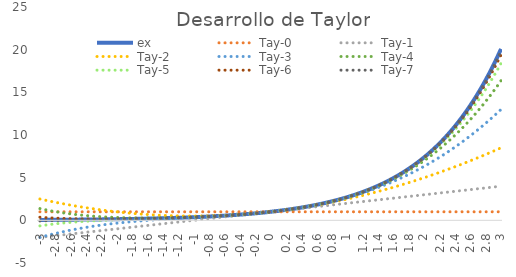
| Category | ex | Tay-0 | Tay-1 | Tay-2 | Tay-3 | Tay-4 | Tay-5 | Tay-6 | Tay-7 |
|---|---|---|---|---|---|---|---|---|---|
| -3.0 | 0.05 | 1 | -2 | 2.5 | -2 | 1.375 | -0.65 | 0.363 | -0.071 |
| -2.95 | 0.052 | 1 | -1.95 | 2.401 | -1.877 | 1.278 | -0.584 | 0.332 | -0.054 |
| -2.9000000000000004 | 0.055 | 1 | -1.9 | 2.305 | -1.76 | 1.187 | -0.522 | 0.304 | -0.038 |
| -2.8500000000000005 | 0.058 | 1 | -1.85 | 2.211 | -1.647 | 1.102 | -0.465 | 0.279 | -0.024 |
| -2.8000000000000007 | 0.061 | 1 | -1.8 | 2.12 | -1.539 | 1.022 | -0.412 | 0.257 | -0.01 |
| -2.750000000000001 | 0.064 | 1 | -1.75 | 2.031 | -1.435 | 0.948 | -0.363 | 0.238 | 0.002 |
| -2.700000000000001 | 0.067 | 1 | -1.7 | 1.945 | -1.336 | 0.879 | -0.317 | 0.221 | 0.014 |
| -2.6500000000000012 | 0.071 | 1 | -1.65 | 1.861 | -1.24 | 0.814 | -0.275 | 0.206 | 0.024 |
| -2.6000000000000014 | 0.074 | 1 | -1.6 | 1.78 | -1.149 | 0.755 | -0.235 | 0.194 | 0.034 |
| -2.5500000000000016 | 0.078 | 1 | -1.55 | 1.701 | -1.062 | 0.699 | -0.199 | 0.183 | 0.044 |
| -2.5000000000000018 | 0.082 | 1 | -1.5 | 1.625 | -0.979 | 0.648 | -0.165 | 0.174 | 0.053 |
| -2.450000000000002 | 0.086 | 1 | -1.45 | 1.551 | -0.9 | 0.601 | -0.134 | 0.166 | 0.061 |
| -2.400000000000002 | 0.091 | 1 | -1.4 | 1.48 | -0.824 | 0.558 | -0.105 | 0.16 | 0.069 |
| -2.3500000000000023 | 0.095 | 1 | -1.35 | 1.411 | -0.752 | 0.519 | -0.078 | 0.156 | 0.077 |
| -2.3000000000000025 | 0.1 | 1 | -1.3 | 1.345 | -0.683 | 0.483 | -0.053 | 0.152 | 0.085 |
| -2.2500000000000027 | 0.105 | 1 | -1.25 | 1.281 | -0.617 | 0.451 | -0.03 | 0.15 | 0.092 |
| -2.200000000000003 | 0.111 | 1 | -1.2 | 1.22 | -0.555 | 0.421 | -0.008 | 0.149 | 0.1 |
| -2.150000000000003 | 0.116 | 1 | -1.15 | 1.161 | -0.495 | 0.395 | 0.012 | 0.15 | 0.107 |
| -2.100000000000003 | 0.122 | 1 | -1.1 | 1.105 | -0.439 | 0.372 | 0.031 | 0.151 | 0.115 |
| -2.0500000000000034 | 0.129 | 1 | -1.05 | 1.051 | -0.385 | 0.351 | 0.05 | 0.153 | 0.122 |
| -2.0000000000000036 | 0.135 | 1 | -1 | 1 | -0.333 | 0.333 | 0.067 | 0.156 | 0.13 |
| -1.9500000000000035 | 0.142 | 1 | -0.95 | 0.951 | -0.285 | 0.318 | 0.083 | 0.159 | 0.138 |
| -1.9000000000000035 | 0.15 | 1 | -0.9 | 0.905 | -0.238 | 0.305 | 0.098 | 0.164 | 0.146 |
| -1.8500000000000034 | 0.157 | 1 | -0.85 | 0.861 | -0.194 | 0.294 | 0.113 | 0.169 | 0.154 |
| -1.8000000000000034 | 0.165 | 1 | -0.8 | 0.82 | -0.152 | 0.285 | 0.128 | 0.175 | 0.163 |
| -1.7500000000000033 | 0.174 | 1 | -0.75 | 0.781 | -0.112 | 0.279 | 0.142 | 0.182 | 0.172 |
| -1.7000000000000033 | 0.183 | 1 | -0.7 | 0.745 | -0.074 | 0.274 | 0.156 | 0.189 | 0.181 |
| -1.6500000000000032 | 0.192 | 1 | -0.65 | 0.711 | -0.037 | 0.271 | 0.169 | 0.198 | 0.191 |
| -1.6000000000000032 | 0.202 | 1 | -0.6 | 0.68 | -0.003 | 0.27 | 0.183 | 0.206 | 0.201 |
| -1.5500000000000032 | 0.212 | 1 | -0.55 | 0.651 | 0.031 | 0.271 | 0.197 | 0.216 | 0.212 |
| -1.500000000000003 | 0.223 | 1 | -0.5 | 0.625 | 0.062 | 0.273 | 0.21 | 0.226 | 0.223 |
| -1.450000000000003 | 0.235 | 1 | -0.45 | 0.601 | 0.093 | 0.277 | 0.224 | 0.237 | 0.234 |
| -1.400000000000003 | 0.247 | 1 | -0.4 | 0.58 | 0.123 | 0.283 | 0.238 | 0.248 | 0.246 |
| -1.350000000000003 | 0.259 | 1 | -0.35 | 0.561 | 0.151 | 0.29 | 0.252 | 0.261 | 0.259 |
| -1.300000000000003 | 0.273 | 1 | -0.3 | 0.545 | 0.179 | 0.298 | 0.267 | 0.274 | 0.272 |
| -1.2500000000000029 | 0.287 | 1 | -0.25 | 0.531 | 0.206 | 0.307 | 0.282 | 0.287 | 0.286 |
| -1.2000000000000028 | 0.301 | 1 | -0.2 | 0.52 | 0.232 | 0.318 | 0.298 | 0.302 | 0.301 |
| -1.1500000000000028 | 0.317 | 1 | -0.15 | 0.511 | 0.258 | 0.331 | 0.314 | 0.317 | 0.317 |
| -1.1000000000000028 | 0.333 | 1 | -0.1 | 0.505 | 0.283 | 0.344 | 0.331 | 0.333 | 0.333 |
| -1.0500000000000027 | 0.35 | 1 | -0.05 | 0.501 | 0.308 | 0.359 | 0.348 | 0.35 | 0.35 |
| -1.0000000000000027 | 0.368 | 1 | 0 | 0.5 | 0.333 | 0.375 | 0.367 | 0.368 | 0.368 |
| -0.9500000000000026 | 0.387 | 1 | 0.05 | 0.501 | 0.358 | 0.392 | 0.386 | 0.387 | 0.387 |
| -0.9000000000000026 | 0.407 | 1 | 0.1 | 0.505 | 0.383 | 0.411 | 0.406 | 0.407 | 0.407 |
| -0.8500000000000025 | 0.427 | 1 | 0.15 | 0.511 | 0.409 | 0.431 | 0.427 | 0.427 | 0.427 |
| -0.8000000000000025 | 0.449 | 1 | 0.2 | 0.52 | 0.435 | 0.452 | 0.449 | 0.449 | 0.449 |
| -0.7500000000000024 | 0.472 | 1 | 0.25 | 0.531 | 0.461 | 0.474 | 0.472 | 0.472 | 0.472 |
| -0.7000000000000024 | 0.497 | 1 | 0.3 | 0.545 | 0.488 | 0.498 | 0.496 | 0.497 | 0.497 |
| -0.6500000000000024 | 0.522 | 1 | 0.35 | 0.561 | 0.515 | 0.523 | 0.522 | 0.522 | 0.522 |
| -0.6000000000000023 | 0.549 | 1 | 0.4 | 0.58 | 0.544 | 0.549 | 0.549 | 0.549 | 0.549 |
| -0.5500000000000023 | 0.577 | 1 | 0.45 | 0.601 | 0.574 | 0.577 | 0.577 | 0.577 | 0.577 |
| -0.5000000000000022 | 0.607 | 1 | 0.5 | 0.625 | 0.604 | 0.607 | 0.607 | 0.607 | 0.607 |
| -0.45000000000000223 | 0.638 | 1 | 0.55 | 0.651 | 0.636 | 0.638 | 0.638 | 0.638 | 0.638 |
| -0.40000000000000224 | 0.67 | 1 | 0.6 | 0.68 | 0.669 | 0.67 | 0.67 | 0.67 | 0.67 |
| -0.35000000000000225 | 0.705 | 1 | 0.65 | 0.711 | 0.704 | 0.705 | 0.705 | 0.705 | 0.705 |
| -0.30000000000000226 | 0.741 | 1 | 0.7 | 0.745 | 0.74 | 0.741 | 0.741 | 0.741 | 0.741 |
| -0.2500000000000023 | 0.779 | 1 | 0.75 | 0.781 | 0.779 | 0.779 | 0.779 | 0.779 | 0.779 |
| -0.2000000000000023 | 0.819 | 1 | 0.8 | 0.82 | 0.819 | 0.819 | 0.819 | 0.819 | 0.819 |
| -0.1500000000000023 | 0.861 | 1 | 0.85 | 0.861 | 0.861 | 0.861 | 0.861 | 0.861 | 0.861 |
| -0.1000000000000023 | 0.905 | 1 | 0.9 | 0.905 | 0.905 | 0.905 | 0.905 | 0.905 | 0.905 |
| -0.05000000000000229 | 0.951 | 1 | 0.95 | 0.951 | 0.951 | 0.951 | 0.951 | 0.951 | 0.951 |
| 0.0 | 1 | 1 | 1 | 1 | 1 | 1 | 1 | 1 | 1 |
| 0.05 | 1.051 | 1 | 1.05 | 1.051 | 1.051 | 1.051 | 1.051 | 1.051 | 1.051 |
| 0.1 | 1.105 | 1 | 1.1 | 1.105 | 1.105 | 1.105 | 1.105 | 1.105 | 1.105 |
| 0.15000000000000002 | 1.162 | 1 | 1.15 | 1.161 | 1.162 | 1.162 | 1.162 | 1.162 | 1.162 |
| 0.2 | 1.221 | 1 | 1.2 | 1.22 | 1.221 | 1.221 | 1.221 | 1.221 | 1.221 |
| 0.25 | 1.284 | 1 | 1.25 | 1.281 | 1.284 | 1.284 | 1.284 | 1.284 | 1.284 |
| 0.3 | 1.35 | 1 | 1.3 | 1.345 | 1.35 | 1.35 | 1.35 | 1.35 | 1.35 |
| 0.35 | 1.419 | 1 | 1.35 | 1.411 | 1.418 | 1.419 | 1.419 | 1.419 | 1.419 |
| 0.39999999999999997 | 1.492 | 1 | 1.4 | 1.48 | 1.491 | 1.492 | 1.492 | 1.492 | 1.492 |
| 0.44999999999999996 | 1.568 | 1 | 1.45 | 1.551 | 1.566 | 1.568 | 1.568 | 1.568 | 1.568 |
| 0.49999999999999994 | 1.649 | 1 | 1.5 | 1.625 | 1.646 | 1.648 | 1.649 | 1.649 | 1.649 |
| 0.5499999999999999 | 1.733 | 1 | 1.55 | 1.701 | 1.729 | 1.733 | 1.733 | 1.733 | 1.733 |
| 0.6 | 1.822 | 1 | 1.6 | 1.78 | 1.816 | 1.821 | 1.822 | 1.822 | 1.822 |
| 0.65 | 1.916 | 1 | 1.65 | 1.861 | 1.907 | 1.914 | 1.915 | 1.916 | 1.916 |
| 0.7000000000000001 | 2.014 | 1 | 1.7 | 1.945 | 2.002 | 2.012 | 2.014 | 2.014 | 2.014 |
| 0.7500000000000001 | 2.117 | 1 | 1.75 | 2.031 | 2.102 | 2.115 | 2.117 | 2.117 | 2.117 |
| 0.8000000000000002 | 2.226 | 1 | 1.8 | 2.12 | 2.205 | 2.222 | 2.225 | 2.225 | 2.226 |
| 0.8500000000000002 | 2.34 | 1 | 1.85 | 2.211 | 2.314 | 2.335 | 2.339 | 2.34 | 2.34 |
| 0.9000000000000002 | 2.46 | 1 | 1.9 | 2.305 | 2.427 | 2.454 | 2.459 | 2.459 | 2.46 |
| 0.9500000000000003 | 2.586 | 1 | 1.95 | 2.401 | 2.544 | 2.578 | 2.585 | 2.586 | 2.586 |
| 1.0000000000000002 | 2.718 | 1 | 2 | 2.5 | 2.667 | 2.708 | 2.717 | 2.718 | 2.718 |
| 1.0500000000000003 | 2.858 | 1 | 2.05 | 2.601 | 2.794 | 2.845 | 2.855 | 2.857 | 2.858 |
| 1.1000000000000003 | 3.004 | 1 | 2.1 | 2.705 | 2.927 | 2.988 | 3.001 | 3.004 | 3.004 |
| 1.1500000000000004 | 3.158 | 1 | 2.15 | 2.811 | 3.065 | 3.138 | 3.154 | 3.158 | 3.158 |
| 1.2000000000000004 | 3.32 | 1 | 2.2 | 2.92 | 3.208 | 3.294 | 3.315 | 3.319 | 3.32 |
| 1.2500000000000004 | 3.49 | 1 | 2.25 | 3.031 | 3.357 | 3.458 | 3.484 | 3.489 | 3.49 |
| 1.3000000000000005 | 3.669 | 1 | 2.3 | 3.145 | 3.511 | 3.63 | 3.661 | 3.668 | 3.669 |
| 1.3500000000000005 | 3.857 | 1 | 2.35 | 3.261 | 3.671 | 3.81 | 3.847 | 3.855 | 3.857 |
| 1.4000000000000006 | 4.055 | 1 | 2.4 | 3.38 | 3.837 | 3.997 | 4.042 | 4.053 | 4.055 |
| 1.4500000000000006 | 4.263 | 1 | 2.45 | 3.501 | 4.009 | 4.194 | 4.247 | 4.26 | 4.263 |
| 1.5000000000000007 | 4.482 | 1 | 2.5 | 3.625 | 4.188 | 4.398 | 4.462 | 4.478 | 4.481 |
| 1.5500000000000007 | 4.711 | 1 | 2.55 | 3.751 | 4.372 | 4.612 | 4.687 | 4.706 | 4.71 |
| 1.6000000000000008 | 4.953 | 1 | 2.6 | 3.88 | 4.563 | 4.836 | 4.923 | 4.946 | 4.952 |
| 1.6500000000000008 | 5.207 | 1 | 2.65 | 4.011 | 4.76 | 5.069 | 5.171 | 5.199 | 5.205 |
| 1.7000000000000008 | 5.474 | 1 | 2.7 | 4.145 | 4.964 | 5.312 | 5.43 | 5.464 | 5.472 |
| 1.7500000000000009 | 5.755 | 1 | 2.75 | 4.281 | 5.174 | 5.565 | 5.702 | 5.742 | 5.752 |
| 1.800000000000001 | 6.05 | 1 | 2.8 | 4.42 | 5.392 | 5.829 | 5.987 | 6.034 | 6.046 |
| 1.850000000000001 | 6.36 | 1 | 2.85 | 4.561 | 5.617 | 6.105 | 6.285 | 6.341 | 6.356 |
| 1.900000000000001 | 6.686 | 1 | 2.9 | 4.705 | 5.848 | 6.391 | 6.598 | 6.663 | 6.681 |
| 1.950000000000001 | 7.029 | 1 | 2.95 | 4.851 | 6.087 | 6.69 | 6.924 | 7.001 | 7.022 |
| 2.000000000000001 | 7.389 | 1 | 3 | 5 | 6.333 | 7 | 7.267 | 7.356 | 7.381 |
| 2.0500000000000007 | 7.768 | 1 | 3.05 | 5.151 | 6.587 | 7.323 | 7.625 | 7.728 | 7.758 |
| 2.1000000000000005 | 8.166 | 1 | 3.1 | 5.305 | 6.849 | 7.659 | 7.999 | 8.118 | 8.154 |
| 2.1500000000000004 | 8.585 | 1 | 3.15 | 5.461 | 7.118 | 8.008 | 8.391 | 8.528 | 8.57 |
| 2.2 | 9.025 | 1 | 3.2 | 5.62 | 7.395 | 8.371 | 8.8 | 8.958 | 9.007 |
| 2.25 | 9.488 | 1 | 3.25 | 5.781 | 7.68 | 8.748 | 9.228 | 9.408 | 9.466 |
| 2.3 | 9.974 | 1 | 3.3 | 5.945 | 7.973 | 9.139 | 9.675 | 9.881 | 9.948 |
| 2.3499999999999996 | 10.486 | 1 | 3.35 | 6.111 | 8.274 | 9.545 | 10.142 | 10.376 | 10.455 |
| 2.3999999999999995 | 11.023 | 1 | 3.4 | 6.28 | 8.584 | 9.966 | 10.63 | 10.895 | 10.986 |
| 2.4499999999999993 | 11.588 | 1 | 3.45 | 6.451 | 8.902 | 10.404 | 11.139 | 11.44 | 11.545 |
| 2.499999999999999 | 12.182 | 1 | 3.5 | 6.625 | 9.229 | 10.857 | 11.671 | 12.01 | 12.131 |
| 2.549999999999999 | 12.807 | 1 | 3.55 | 6.801 | 9.565 | 11.327 | 12.225 | 12.607 | 12.746 |
| 2.5999999999999988 | 13.464 | 1 | 3.6 | 6.98 | 9.909 | 11.813 | 12.804 | 13.233 | 13.392 |
| 2.6499999999999986 | 14.154 | 1 | 3.65 | 7.161 | 10.263 | 12.318 | 13.407 | 13.888 | 14.07 |
| 2.6999999999999984 | 14.88 | 1 | 3.7 | 7.345 | 10.625 | 12.84 | 14.036 | 14.574 | 14.781 |
| 2.7499999999999982 | 15.643 | 1 | 3.75 | 7.531 | 10.997 | 13.38 | 14.691 | 15.292 | 15.528 |
| 2.799999999999998 | 16.445 | 1 | 3.8 | 7.72 | 11.379 | 13.94 | 15.374 | 16.043 | 16.311 |
| 2.849999999999998 | 17.288 | 1 | 3.85 | 7.911 | 11.769 | 14.518 | 16.085 | 16.83 | 17.133 |
| 2.8999999999999977 | 18.174 | 1 | 3.9 | 8.105 | 12.17 | 15.117 | 16.826 | 17.652 | 17.995 |
| 2.9499999999999975 | 19.106 | 1 | 3.95 | 8.301 | 12.58 | 15.736 | 17.597 | 18.513 | 18.898 |
| 2.9999999999999973 | 20.086 | 1 | 4 | 8.5 | 13 | 16.375 | 18.4 | 19.412 | 19.846 |